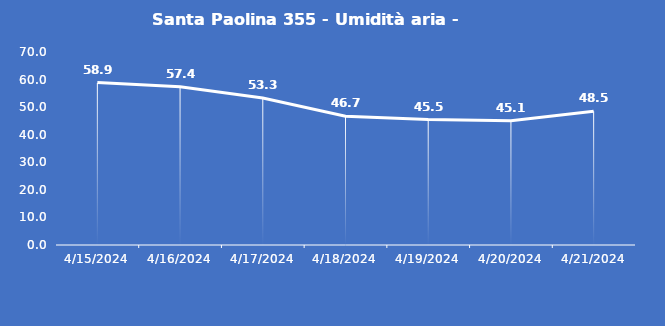
| Category | Santa Paolina 355 - Umidità aria - Grezzo (%) |
|---|---|
| 4/15/24 | 58.9 |
| 4/16/24 | 57.4 |
| 4/17/24 | 53.3 |
| 4/18/24 | 46.7 |
| 4/19/24 | 45.5 |
| 4/20/24 | 45.1 |
| 4/21/24 | 48.5 |